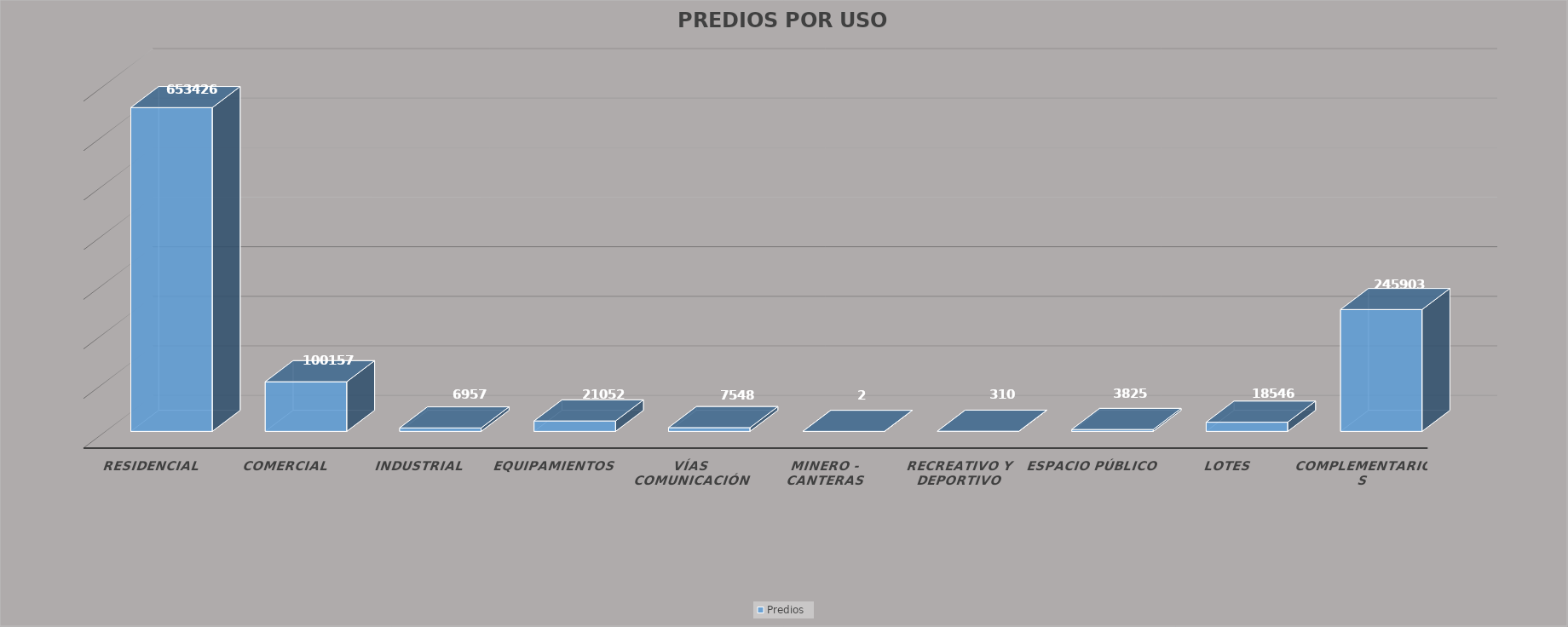
| Category | Predios |
|---|---|
| RESIDENCIAL | 653426 |
| COMERCIAL | 100157 |
| INDUSTRIAL | 6957 |
| EQUIPAMIENTOS | 21052 |
| VÍAS COMUNICACIÓN | 7548 |
| MINERO - CANTERAS | 2 |
| RECREATIVO Y DEPORTIVO | 310 |
| ESPACIO PÚBLICO | 3825 |
|  LOTES | 18546 |
| COMPLEMENTARIOS | 245903 |